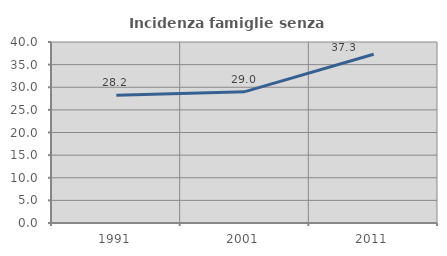
| Category | Incidenza famiglie senza nuclei |
|---|---|
| 1991.0 | 28.205 |
| 2001.0 | 29.032 |
| 2011.0 | 37.297 |